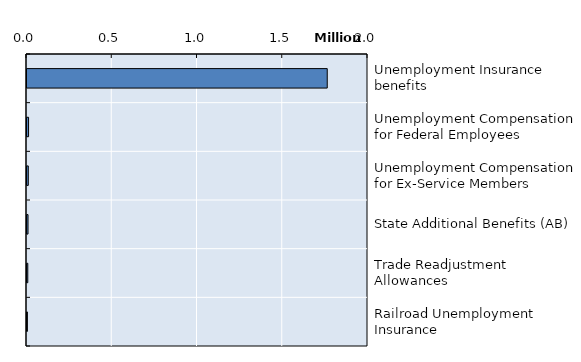
| Category | Series 0 |
|---|---|
| Unemployment Insurance benefits | 1760959 |
| Unemployment Compensation for Federal Employees | 9178.712 |
| Unemployment Compensation for Ex-Service Members | 7557 |
| State Additional Benefits (AB) | 5975 |
| Trade Readjustment Allowances | 4668 |
| Railroad Unemployment Insurance | 2350 |